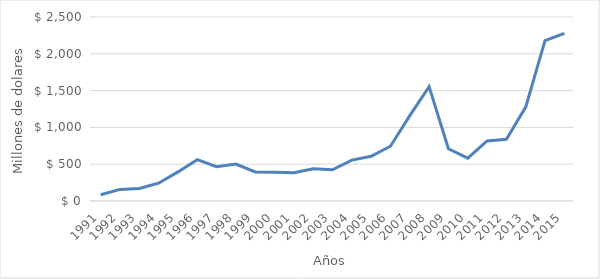
| Category | Precio CIF(US$ millones) |
|---|---|
| 1991.0 | 83.976 |
| 1992.0 | 157.486 |
| 1993.0 | 171.183 |
| 1994.0 | 242.112 |
| 1995.0 | 395.328 |
| 1996.0 | 561.155 |
| 1997.0 | 467.225 |
| 1998.0 | 502.668 |
| 1999.0 | 395.624 |
| 2000.0 | 389.667 |
| 2001.0 | 384.071 |
| 2002.0 | 437.19 |
| 2003.0 | 424.755 |
| 2004.0 | 555.221 |
| 2005.0 | 606.819 |
| 2006.0 | 744.44 |
| 2007.0 | 1159.244 |
| 2008.0 | 1553.697 |
| 2009.0 | 709.753 |
| 2010.0 | 581.851 |
| 2011.0 | 816.163 |
| 2012.0 | 837.441 |
| 2013.0 | 1275.345 |
| 2014.0 | 2179.703 |
| 2015.0 | 2278.706 |